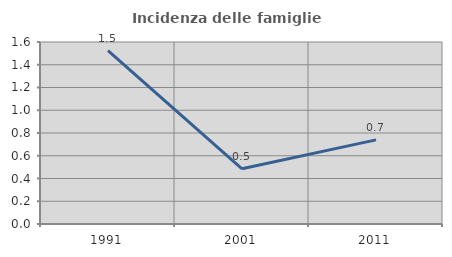
| Category | Incidenza delle famiglie numerose |
|---|---|
| 1991.0 | 1.524 |
| 2001.0 | 0.485 |
| 2011.0 | 0.74 |